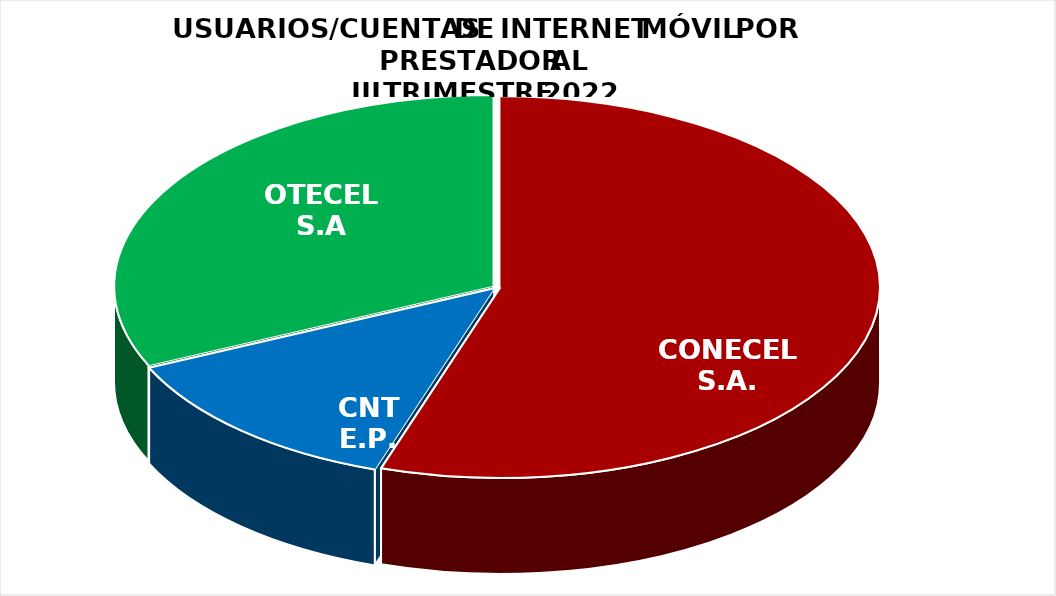
| Category | Series 0 |
|---|---|
| CONECEL S.A. | 5815020 |
| CNT E.P. | 1379473 |
| OTECEL S.A | 3360214 |